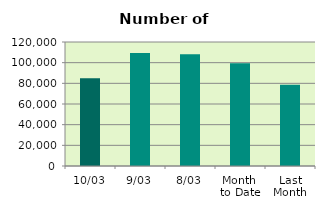
| Category | Series 0 |
|---|---|
| 10/03 | 85032 |
| 9/03 | 109392 |
| 8/03 | 108048 |
| Month 
to Date | 99438.5 |
| Last
Month | 78748.7 |